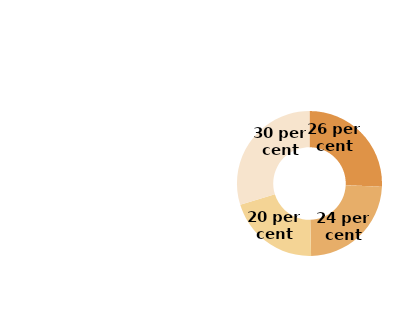
| Category | Series 0 |
|---|---|
| 1-3 years | 151.891 |
| 3-5 years | 141.342 |
| 5-10 years | 121.584 |
| Over 10 years | 175.762 |